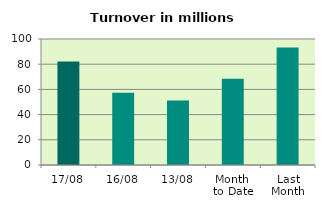
| Category | Series 0 |
|---|---|
| 17/08 | 82.102 |
| 16/08 | 57.301 |
| 13/08 | 51.25 |
| Month 
to Date | 68.365 |
| Last
Month | 93.279 |